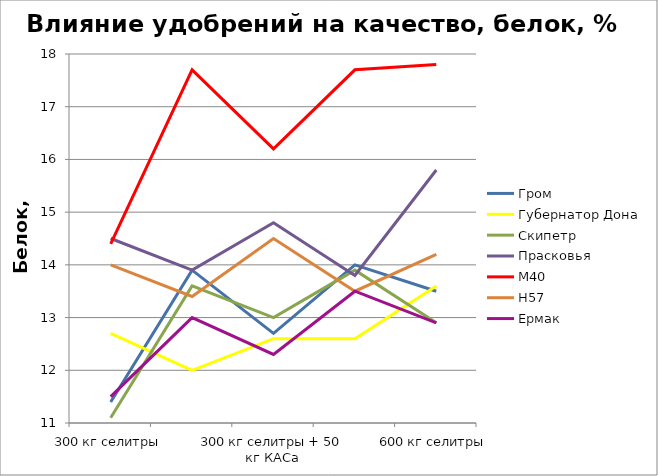
| Category | Гром | Губернатор Дона | Скипетр | Прасковья | М40 | Н57 | Ермак |
|---|---|---|---|---|---|---|---|
| 300 кг селитры | 11.4 | 12.7 | 11.1 | 14.5 | 14.4 | 14 | 11.5 |
| 300 кг селитры + 200 кг сульфата кальция | 13.9 | 12 | 13.6 | 13.9 | 17.7 | 13.4 | 13 |
| 300 кг селитры + 50 кг КАСа | 12.7 | 12.6 | 13 | 14.8 | 16.2 | 14.5 | 12.3 |
| 400 кг селитры | 14 | 12.6 | 13.9 | 13.8 | 17.7 | 13.5 | 13.5 |
| 600 кг селитры | 13.5 | 13.6 | 12.9 | 15.8 | 17.8 | 14.2 | 12.9 |